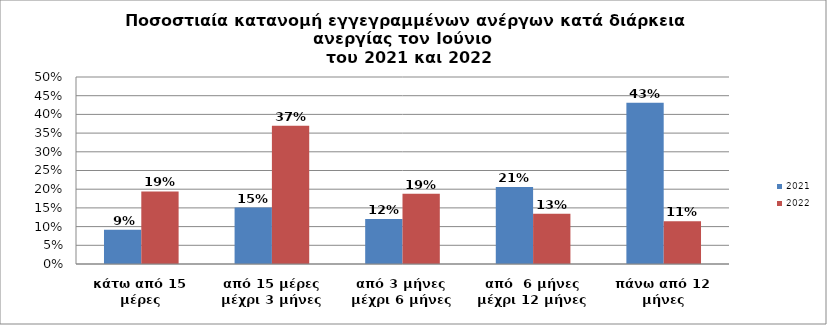
| Category | 2021 | 2022 |
|---|---|---|
| κάτω από 15 μέρες | 0.092 | 0.194 |
| από 15 μέρες μέχρι 3 μήνες | 0.151 | 0.37 |
| από 3 μήνες μέχρι 6 μήνες | 0.12 | 0.188 |
| από  6 μήνες μέχρι 12 μήνες | 0.206 | 0.134 |
| πάνω από 12 μήνες | 0.431 | 0.114 |